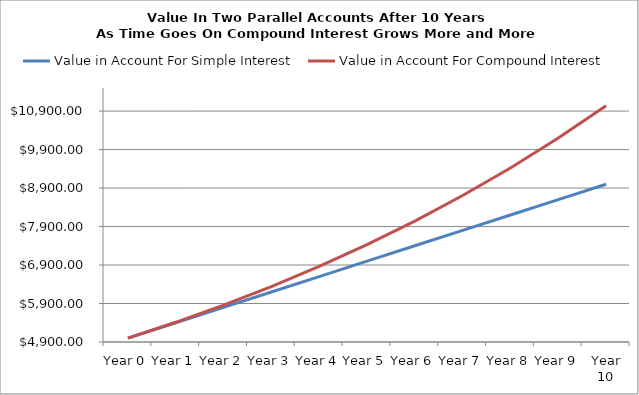
| Category | Value in Account For Simple Interest | Value in Account For Compound Interest |
|---|---|---|
| Year 0 | 5000 | 5000 |
| Year 1 | 5400 | 5412.161 |
| Year 2 | 5800 | 5858.297 |
| Year 3 | 6200 | 6341.209 |
| Year 4 | 6600 | 6863.929 |
| Year 5 | 7000 | 7429.737 |
| Year 6 | 7400 | 8042.186 |
| Year 7 | 7800 | 8705.121 |
| Year 8 | 8200 | 9422.703 |
| Year 9 | 8600 | 10199.437 |
| Year 10 | 9000 | 11040.198 |